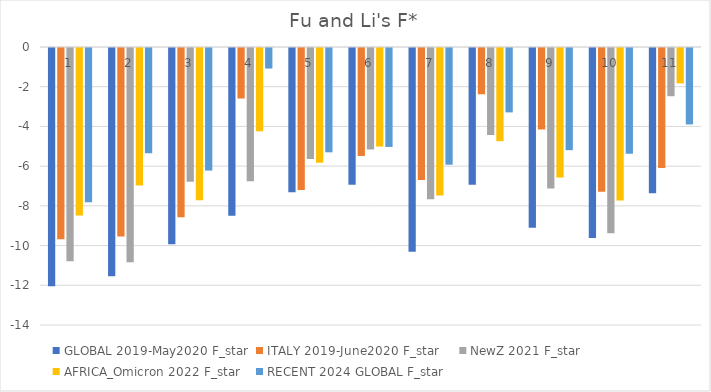
| Category | GLOBAL 2019-May2020 | ITALY 2019-June2020 | NewZ 2021 | AFRICA_Omicron 2022 | RECENT 2024 GLOBAL |
|---|---|---|---|---|---|
| 0 | -11.996 | -9.629 | -10.74 | -8.43 | -7.771 |
| 1 | -11.499 | -9.496 | -10.793 | -6.92 | -5.298 |
| 2 | -9.882 | -8.521 | -6.738 | -7.665 | -6.172 |
| 3 | -8.447 | -2.544 | -6.709 | -4.196 | -1.035 |
| 4 | -7.269 | -7.149 | -5.588 | -5.778 | -5.254 |
| 5 | -6.885 | -5.436 | -5.117 | -4.963 | -4.983 |
| 6 | -10.262 | -6.651 | -7.616 | -7.432 | -5.877 |
| 7 | -6.886 | -2.33 | -4.382 | -4.694 | -3.243 |
| 8 | -9.048 | -4.103 | -7.07 | -6.527 | -5.145 |
| 9 | -9.571 | -7.244 | -9.331 | -7.686 | -5.325 |
| 10 | -7.311 | -6.042 | -2.428 | -1.782 | -3.85 |